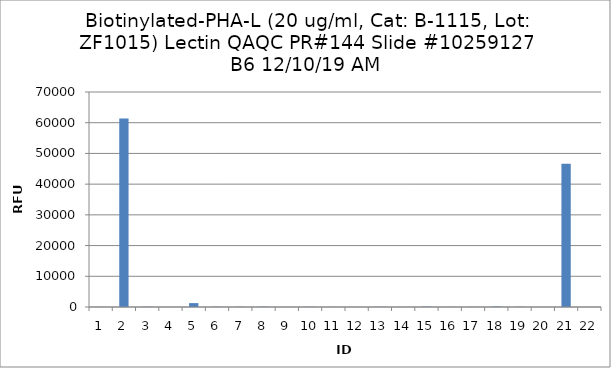
| Category | Series 0 |
|---|---|
| 0 | 35.75 |
| 1 | 61385 |
| 2 | 67.5 |
| 3 | 18 |
| 4 | 1267.25 |
| 5 | 78.75 |
| 6 | 65.25 |
| 7 | 101.25 |
| 8 | 28 |
| 9 | 56.75 |
| 10 | 39.25 |
| 11 | -57.5 |
| 12 | 46.5 |
| 13 | 30.25 |
| 14 | 113.5 |
| 15 | 37 |
| 16 | 46 |
| 17 | 152 |
| 18 | 63.75 |
| 19 | 6.75 |
| 20 | 46607 |
| 21 | -3.25 |